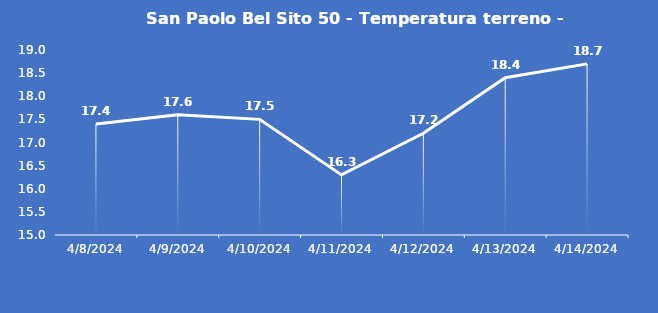
| Category | San Paolo Bel Sito 50 - Temperatura terreno - Grezzo (°C) |
|---|---|
| 4/8/24 | 17.4 |
| 4/9/24 | 17.6 |
| 4/10/24 | 17.5 |
| 4/11/24 | 16.3 |
| 4/12/24 | 17.2 |
| 4/13/24 | 18.4 |
| 4/14/24 | 18.7 |